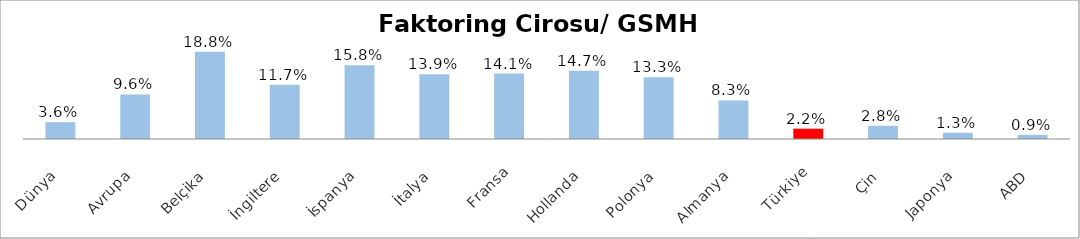
| Category | Faktoring Cirosu/ GSMH (%) |
|---|---|
| Dünya | 0.036 |
| Avrupa | 0.096 |
| Belçika | 0.188 |
| İngiltere | 0.117 |
| İspanya | 0.158 |
| İtalya | 0.139 |
| Fransa | 0.141 |
| Hollanda | 0.147 |
| Polonya | 0.133 |
| Almanya | 0.083 |
| Türkiye | 0.022 |
| Çin | 0.028 |
| Japonya | 0.013 |
| ABD | 0.009 |